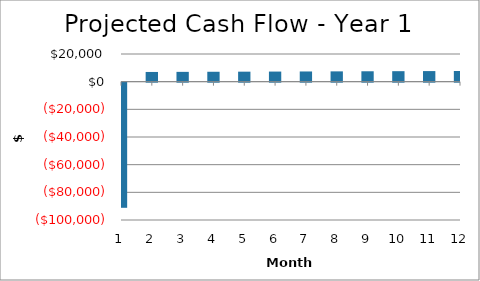
| Category | Year 1 |
|---|---|
| 1.0 | -90456.023 |
| 2.0 | 7016.73 |
| 3.0 | 7088.584 |
| 4.0 | 7160.094 |
| 5.0 | 7231.262 |
| 6.0 | 7302.09 |
| 7.0 | 7372.58 |
| 8.0 | 7442.733 |
| 9.0 | 7512.551 |
| 10.0 | 7582.037 |
| 11.0 | 7651.191 |
| 12.0 | 7720.015 |